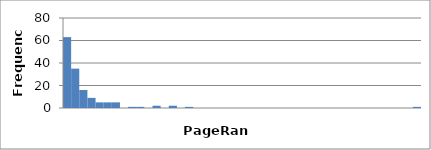
| Category | 63 |
|---|---|
| 0.0 | 63 |
| 0.023255813953488372 | 35 |
| 0.046511627906976744 | 16 |
| 0.06976744186046512 | 9 |
| 0.09302325581395349 | 5 |
| 0.11627906976744186 | 5 |
| 0.13953488372093023 | 5 |
| 0.16279069767441862 | 0 |
| 0.18604651162790697 | 1 |
| 0.20930232558139533 | 1 |
| 0.2325581395348837 | 0 |
| 0.25581395348837205 | 2 |
| 0.2790697674418604 | 0 |
| 0.30232558139534876 | 2 |
| 0.3255813953488371 | 0 |
| 0.3488372093023255 | 1 |
| 0.37209302325581384 | 0 |
| 0.3953488372093022 | 0 |
| 0.41860465116279055 | 0 |
| 0.4418604651162789 | 0 |
| 0.46511627906976727 | 0 |
| 0.4883720930232556 | 0 |
| 0.511627906976744 | 0 |
| 0.5348837209302324 | 0 |
| 0.5581395348837208 | 0 |
| 0.5813953488372092 | 0 |
| 0.6046511627906976 | 0 |
| 0.627906976744186 | 0 |
| 0.6511627906976745 | 0 |
| 0.6744186046511629 | 0 |
| 0.6976744186046513 | 0 |
| 0.7209302325581397 | 0 |
| 0.7441860465116281 | 0 |
| 0.7674418604651165 | 0 |
| 0.790697674418605 | 0 |
| 0.8139534883720934 | 0 |
| 0.8372093023255818 | 0 |
| 0.8604651162790702 | 0 |
| 0.8837209302325586 | 0 |
| 0.906976744186047 | 0 |
| 0.9302325581395354 | 0 |
| 0.9534883720930238 | 0 |
| 0.9767441860465123 | 0 |
| 1.0 | 1 |